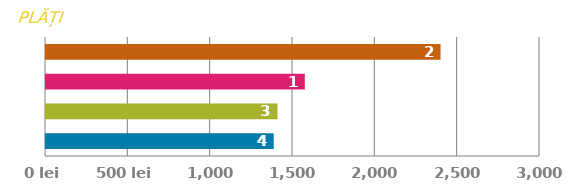
| Category | PLATĂ |
|---|---|
| 0 | 1382.921 |
| 1 | 1405.775 |
| 2 | 1571.655 |
| 3 | 2396.046 |